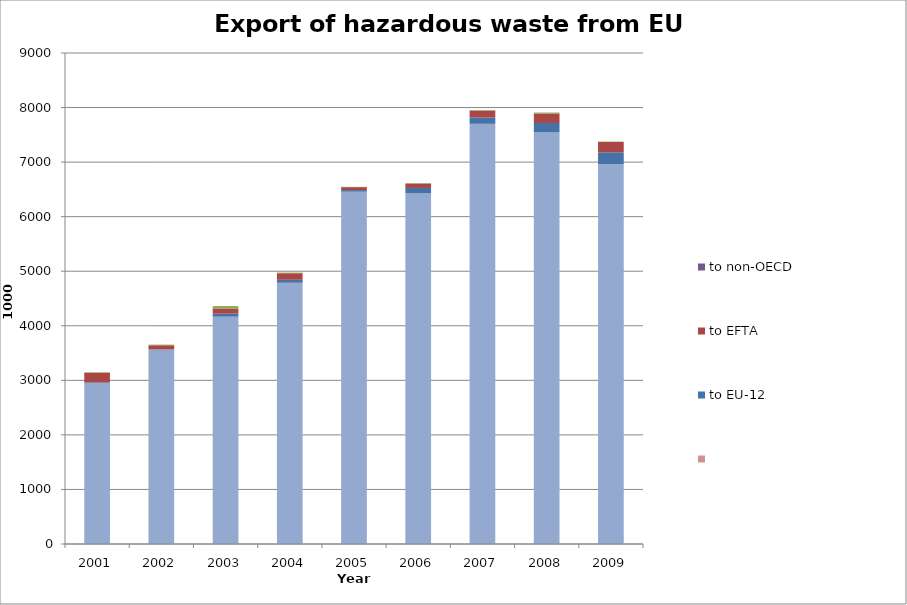
| Category | to EU-15 | Series 7 | to EU-12 | to EFTA | to OECD (non-EFTA) | to non-OECD |
|---|---|---|---|---|---|---|
| 2001.0 | 2946.321 |  | 16.872 | 171.156 | 12.476 |  |
| 2002.0 | 3563.255 |  | 5.195 | 74.401 | 11.362 |  |
| 2003.0 | 4166.111 |  | 55.975 | 92.513 | 45.227 |  |
| 2004.0 | 4788.709 |  | 53.846 | 120.91 | 11.566 |  |
| 2005.0 | 6457.457 |  | 30.266 | 53.206 | 5.772 |  |
| 2006.0 | 6428.364 |  | 97.954 | 81.467 | 6.235 |  |
| 2007.0 | 7701.954 |  | 115.463 | 128.117 | 6.303 |  |
| 2008.0 | 7546.201 |  | 171.287 | 174.143 | 16.871 |  |
| 2009.0 | 6961.391 |  | 217.992 | 188.76 | 7.931 |  |